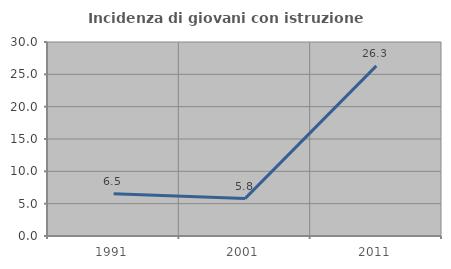
| Category | Incidenza di giovani con istruzione universitaria |
|---|---|
| 1991.0 | 6.542 |
| 2001.0 | 5.785 |
| 2011.0 | 26.316 |